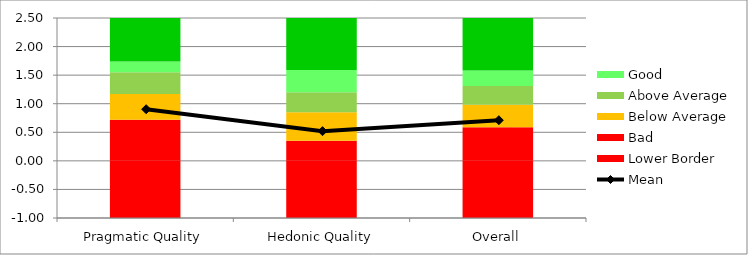
| Category | Lower Border | Bad | Below Average | Above Average | Good | Excellent |
|---|---|---|---|---|---|---|
| Pragmatic Quality | -1 | 0.72 | 0.45 | 0.38 | 0.19 | 0.76 |
| Hedonic Quality | -1 | 0.35 | 0.5 | 0.35 | 0.39 | 0.91 |
| Overall | -1 | 0.59 | 0.39 | 0.33 | 0.27 | 0.92 |